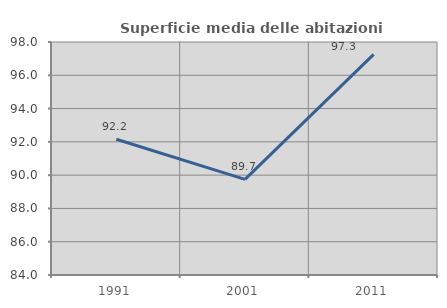
| Category | Superficie media delle abitazioni occupate |
|---|---|
| 1991.0 | 92.16 |
| 2001.0 | 89.745 |
| 2011.0 | 97.253 |